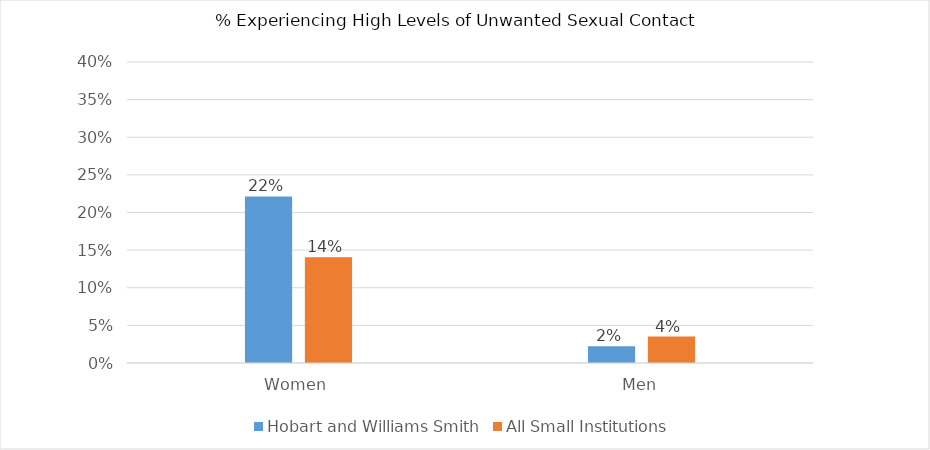
| Category | Hobart and Williams Smith | All Small Institutions |
|---|---|---|
| Women | 0.221 | 0.14 |
| Men | 0.022 | 0.035 |